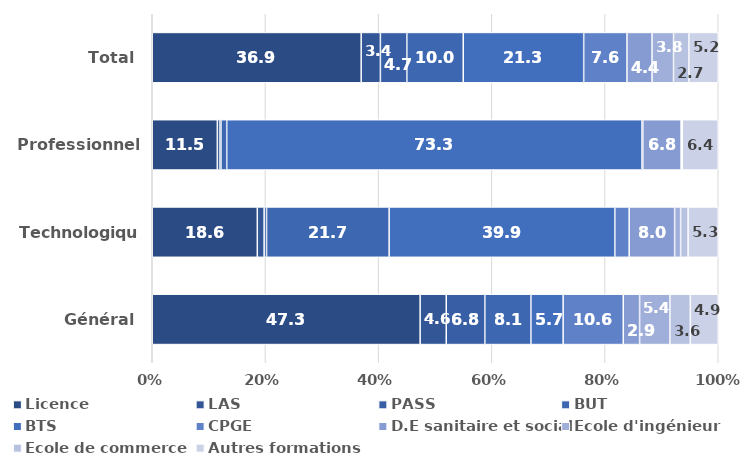
| Category | Licence | LAS | PASS | BUT | BTS | CPGE | D.E sanitaire et social | Ecole d'ingénieur | Ecole de commerce | Autres formations |
|---|---|---|---|---|---|---|---|---|---|---|
| Général | 47.331 | 4.615 | 6.815 | 8.144 | 5.693 | 10.623 | 2.883 | 5.354 | 3.607 | 4.935 |
| Technologique | 18.561 | 1.206 | 0.426 | 21.662 | 39.876 | 2.533 | 8.03 | 1.064 | 1.313 | 5.33 |
| Professionnel | 11.497 | 0.456 | 0.19 | 1.018 | 73.341 | 0.175 | 6.769 | 0.02 | 0.18 | 6.355 |
| Total | 36.915 | 3.392 | 4.673 | 9.969 | 21.279 | 7.647 | 4.423 | 3.802 | 2.703 | 5.197 |